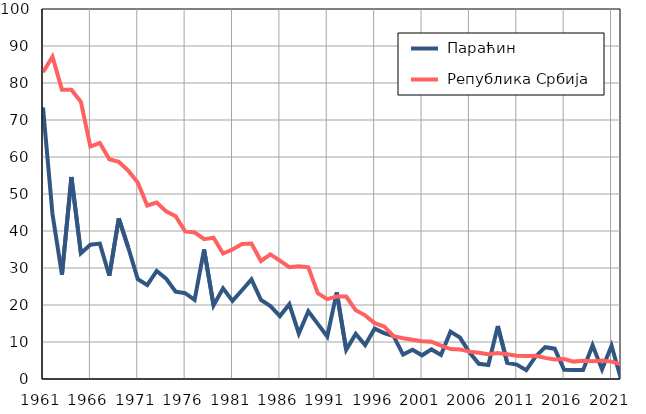
| Category |  Параћин |  Република Србија |
|---|---|---|
| 1961.0 | 73.4 | 82.9 |
| 1962.0 | 44.6 | 87.1 |
| 1963.0 | 28.2 | 78.2 |
| 1964.0 | 54.6 | 78.2 |
| 1965.0 | 34 | 74.9 |
| 1966.0 | 36.3 | 62.8 |
| 1967.0 | 36.6 | 63.8 |
| 1968.0 | 27.9 | 59.4 |
| 1969.0 | 43.4 | 58.7 |
| 1970.0 | 35.5 | 56.3 |
| 1971.0 | 27 | 53.1 |
| 1972.0 | 25.4 | 46.9 |
| 1973.0 | 29.2 | 47.7 |
| 1974.0 | 27.1 | 45.3 |
| 1975.0 | 23.6 | 44 |
| 1976.0 | 23.2 | 39.9 |
| 1977.0 | 21.4 | 39.6 |
| 1978.0 | 35 | 37.8 |
| 1979.0 | 19.9 | 38.2 |
| 1980.0 | 24.5 | 33.9 |
| 1981.0 | 21.1 | 35 |
| 1982.0 | 24 | 36.5 |
| 1983.0 | 26.9 | 36.6 |
| 1984.0 | 21.4 | 31.9 |
| 1985.0 | 19.7 | 33.7 |
| 1986.0 | 17 | 32 |
| 1987.0 | 20.2 | 30.2 |
| 1988.0 | 12.3 | 30.5 |
| 1989.0 | 18.3 | 30.2 |
| 1990.0 | 14.9 | 23.2 |
| 1991.0 | 11.5 | 21.6 |
| 1992.0 | 23.4 | 22.3 |
| 1993.0 | 7.9 | 22.3 |
| 1994.0 | 12.2 | 18.6 |
| 1995.0 | 9.2 | 17.2 |
| 1996.0 | 13.6 | 15.1 |
| 1997.0 | 12.4 | 14.2 |
| 1998.0 | 11.6 | 11.6 |
| 1999.0 | 6.6 | 11 |
| 2000.0 | 7.9 | 10.6 |
| 2001.0 | 6.4 | 10.2 |
| 2002.0 | 8 | 10.1 |
| 2003.0 | 6.5 | 9 |
| 2004.0 | 12.8 | 8.1 |
| 2005.0 | 11.2 | 8 |
| 2006.0 | 7.2 | 7.4 |
| 2007.0 | 4.1 | 7.1 |
| 2008.0 | 3.8 | 6.7 |
| 2009.0 | 14.3 | 7 |
| 2010.0 | 4.3 | 6.7 |
| 2011.0 | 3.9 | 6.3 |
| 2012.0 | 2.4 | 6.2 |
| 2013.0 | 6.1 | 6.3 |
| 2014.0 | 8.6 | 5.7 |
| 2015.0 | 8.2 | 5.3 |
| 2016.0 | 2.5 | 5.4 |
| 2017.0 | 2.4 | 4.7 |
| 2018.0 | 2.4 | 4.9 |
| 2019.0 | 9.1 | 4.8 |
| 2020.0 | 2.6 | 5 |
| 2021.0 | 9 | 4.7 |
| 2022.0 | 0 | 4 |